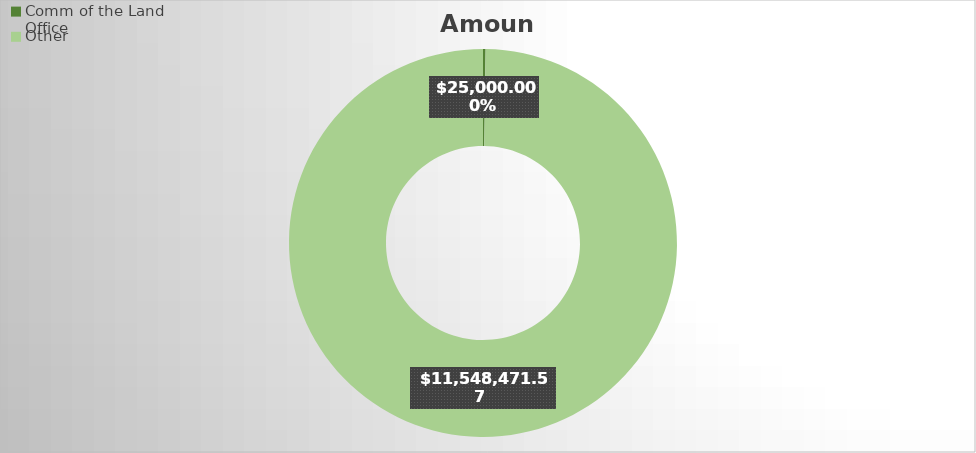
| Category | Amount |
|---|---|
| Comm of the Land Office | 25000 |
| Other | 11548471.57 |